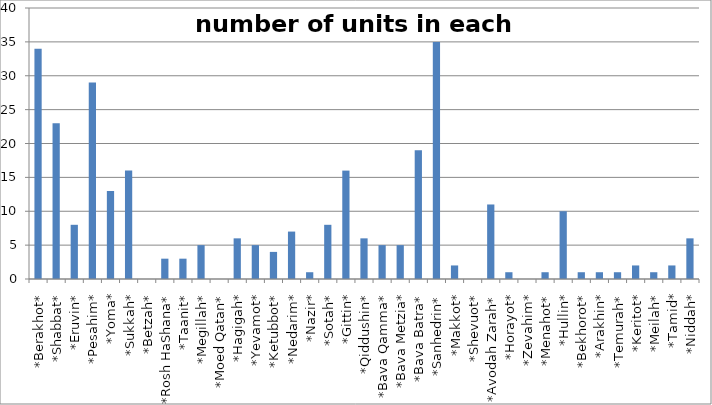
| Category | Series 0 |
|---|---|
| *Berakhot* | 34 |
| *Shabbat* | 23 |
| *Eruvin* | 8 |
| *Pesahim* | 29 |
| *Yoma* | 13 |
| *Sukkah* | 16 |
| *Betzah* | 0 |
| *Rosh HaShana* | 3 |
| *Taanit* | 3 |
| *Megillah* | 5 |
| *Moed Qatan* | 0 |
| *Hagigah* | 6 |
| *Yevamot* | 5 |
| *Ketubbot* | 4 |
| *Nedarim* | 7 |
| *Nazir* | 1 |
| *Sotah* | 8 |
| *Gittin* | 16 |
| *Qiddushin* | 6 |
| *Bava Qamma* | 5 |
| *Bava Metzia* | 5 |
| *Bava Batra* | 19 |
| *Sanhedrin* | 35 |
| *Makkot* | 2 |
| *Shevuot* | 0 |
| *Avodah Zarah* | 11 |
| *Horayot* | 1 |
| *Zevahim* | 0 |
| *Menahot* | 1 |
| *Hullin* | 10 |
| *Bekhorot* | 1 |
| *Arakhin* | 1 |
| *Temurah* | 1 |
| *Keritot* | 2 |
| *Meilah* | 1 |
| *Tamid* | 2 |
| *Niddah* | 6 |